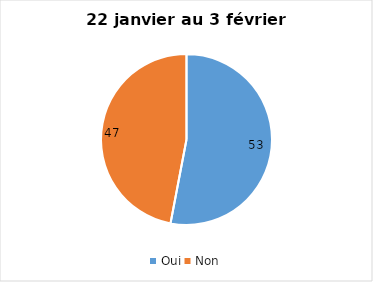
| Category | Series 0 |
|---|---|
| Oui | 53 |
| Non | 47 |